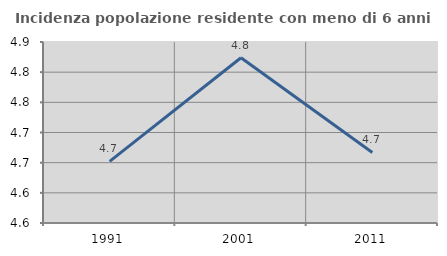
| Category | Incidenza popolazione residente con meno di 6 anni |
|---|---|
| 1991.0 | 4.652 |
| 2001.0 | 4.824 |
| 2011.0 | 4.667 |